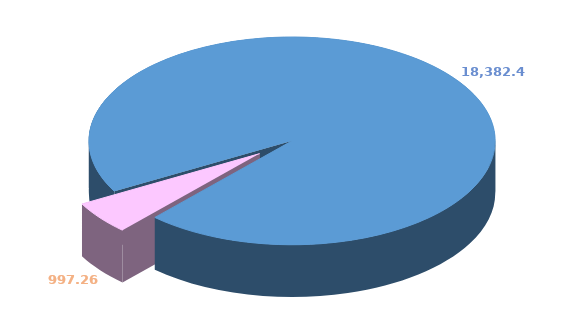
| Category | Series 0 |
|---|---|
| 0 | 18382.42 |
| 1 | 997.263 |